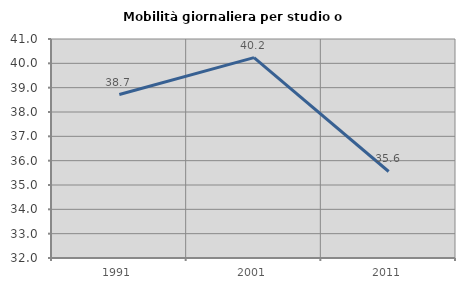
| Category | Mobilità giornaliera per studio o lavoro |
|---|---|
| 1991.0 | 38.718 |
| 2001.0 | 40.234 |
| 2011.0 | 35.556 |